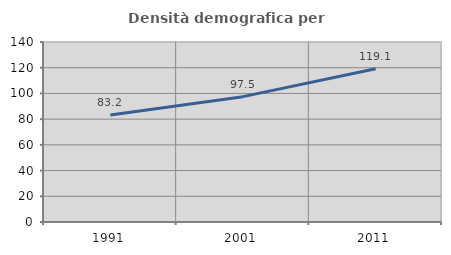
| Category | Densità demografica |
|---|---|
| 1991.0 | 83.238 |
| 2001.0 | 97.5 |
| 2011.0 | 119.123 |